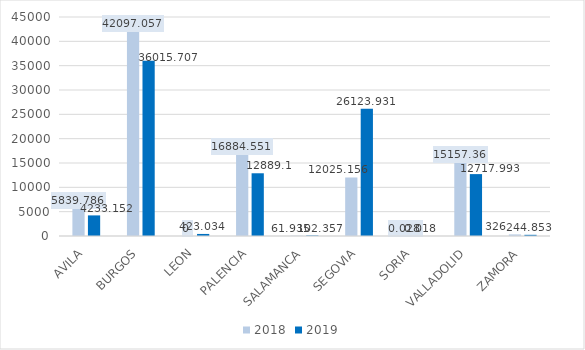
| Category | 2018 | 2019 |
|---|---|---|
| AVILA | 5839.786 | 4233.152 |
| BURGOS | 42097.057 | 36015.707 |
| LEON | 0 | 423.034 |
| PALENCIA | 16884.551 | 12889.1 |
| SALAMANCA | 61.935 | 102.357 |
| SEGOVIA | 12025.156 | 26123.931 |
| SORIA | 0.028 | 0.018 |
| VALLADOLID | 15157.36 | 12717.993 |
| ZAMORA | 326 | 244.853 |